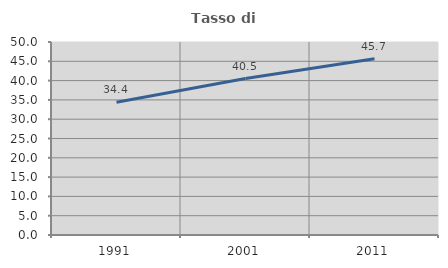
| Category | Tasso di occupazione   |
|---|---|
| 1991.0 | 34.383 |
| 2001.0 | 40.528 |
| 2011.0 | 45.663 |